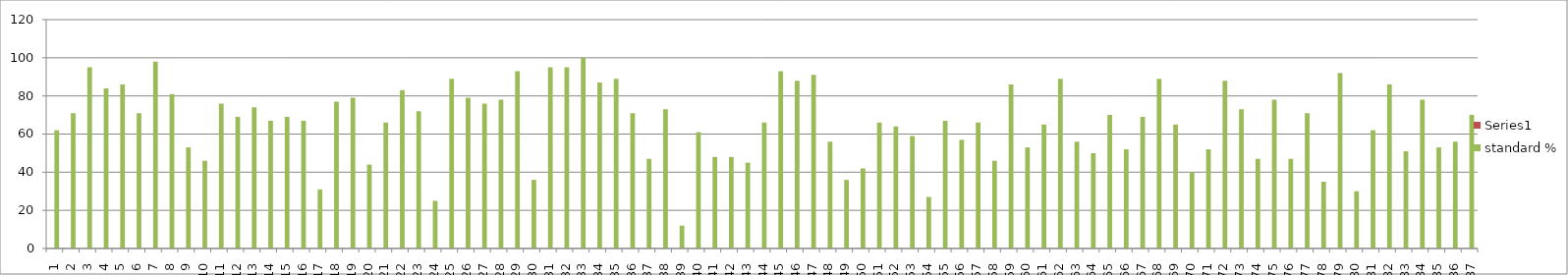
| Category | Series 1 | standard % |
|---|---|---|
| 1.0 | 0 | 62 |
| 2.0 | 0 | 71 |
| 3.0 | 0 | 95 |
| 4.0 | 0 | 84 |
| 5.0 | 0 | 86 |
| 6.0 | 0 | 71 |
| 7.0 | 0 | 98 |
| 8.0 | 0 | 81 |
| 9.0 | 0 | 53 |
| 10.0 | 0 | 46 |
| 11.0 | 0 | 76 |
| 12.0 | 0 | 69 |
| 13.0 | 0 | 74 |
| 14.0 | 0 | 67 |
| 15.0 | 0 | 69 |
| 16.0 | 0 | 67 |
| 17.0 | 0 | 31 |
| 18.0 | 0 | 77 |
| 19.0 | 0 | 79 |
| 20.0 | 0 | 44 |
| 21.0 | 0 | 66 |
| 22.0 | 0 | 83 |
| 23.0 | 0 | 72 |
| 24.0 | 0 | 25 |
| 25.0 | 0 | 89 |
| 26.0 | 0 | 79 |
| 27.0 | 0 | 76 |
| 28.0 | 0 | 78 |
| 29.0 | 0 | 93 |
| 30.0 | 0 | 36 |
| 31.0 | 0 | 95 |
| 32.0 | 0 | 95 |
| 33.0 | 0 | 100 |
| 34.0 | 0 | 87 |
| 35.0 | 0 | 89 |
| 36.0 | 0 | 71 |
| 37.0 | 0 | 47 |
| 38.0 | 0 | 73 |
| 39.0 | 0 | 12 |
| 40.0 | 0 | 61 |
| 41.0 | 0 | 48 |
| 42.0 | 0 | 48 |
| 43.0 | 0 | 45 |
| 44.0 | 0 | 66 |
| 45.0 | 0 | 93 |
| 46.0 | 0 | 88 |
| 47.0 | 0 | 91 |
| 48.0 | 0 | 56 |
| 49.0 | 0 | 36 |
| 50.0 | 0 | 42 |
| 51.0 | 0 | 66 |
| 52.0 | 0 | 64 |
| 53.0 | 0 | 59 |
| 54.0 | 0 | 27 |
| 55.0 | 0 | 67 |
| 56.0 | 0 | 57 |
| 57.0 | 0 | 66 |
| 58.0 | 0 | 46 |
| 59.0 | 0 | 86 |
| 60.0 | 0 | 53 |
| 61.0 | 0 | 65 |
| 62.0 | 0 | 89 |
| 63.0 | 0 | 56 |
| 64.0 | 0 | 50 |
| 65.0 | 0 | 70 |
| 66.0 | 0 | 52 |
| 67.0 | 0 | 69 |
| 68.0 | 0 | 89 |
| 69.0 | 0 | 65 |
| 70.0 | 0 | 40 |
| 71.0 | 0 | 52 |
| 72.0 | 0 | 88 |
| 73.0 | 0 | 73 |
| 74.0 | 0 | 47 |
| 75.0 | 0 | 78 |
| 76.0 | 0 | 47 |
| 77.0 | 0 | 71 |
| 78.0 | 0 | 35 |
| 79.0 | 0 | 92 |
| 80.0 | 0 | 30 |
| 81.0 | 0 | 62 |
| 82.0 | 0 | 86 |
| 83.0 | 0 | 51 |
| 84.0 | 0 | 78 |
| 85.0 | 0 | 53 |
| 86.0 | 0 | 56 |
| 87.0 | 0 | 70 |